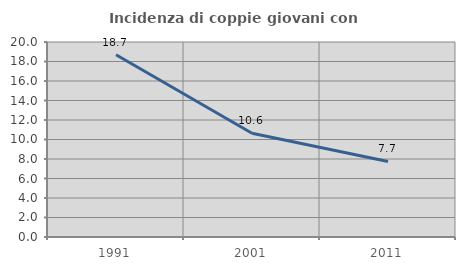
| Category | Incidenza di coppie giovani con figli |
|---|---|
| 1991.0 | 18.689 |
| 2001.0 | 10.647 |
| 2011.0 | 7.745 |